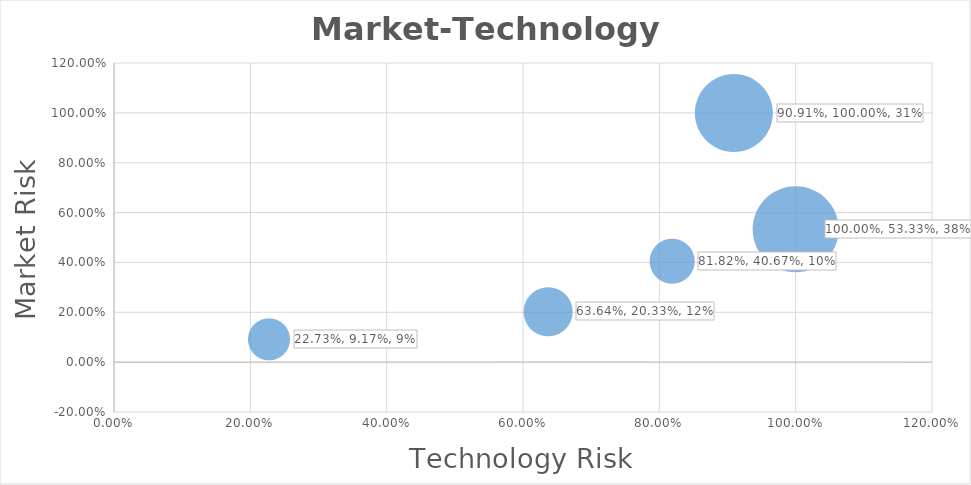
| Category | Series 0 |
|---|---|
| 0.22727272727272727 | 0.092 |
| 0.6363636363636364 | 0.203 |
| 0.9090909090909091 | 1 |
| 0.8181818181818182 | 0.407 |
| 1.0 | 0.533 |